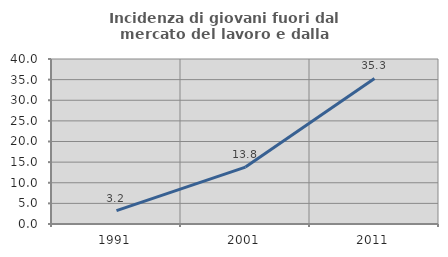
| Category | Incidenza di giovani fuori dal mercato del lavoro e dalla formazione  |
|---|---|
| 1991.0 | 3.226 |
| 2001.0 | 13.793 |
| 2011.0 | 35.294 |